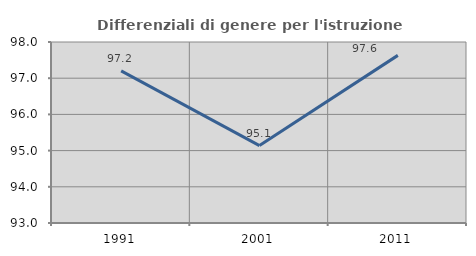
| Category | Differenziali di genere per l'istruzione superiore |
|---|---|
| 1991.0 | 97.2 |
| 2001.0 | 95.138 |
| 2011.0 | 97.631 |